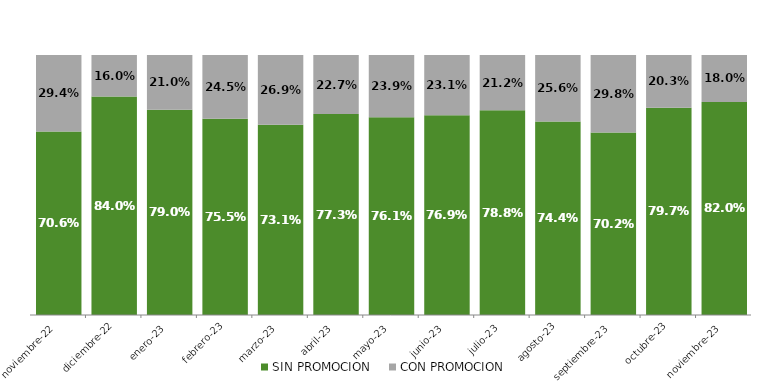
| Category | SIN PROMOCION   | CON PROMOCION   |
|---|---|---|
| 2022-11-01 | 0.706 | 0.294 |
| 2022-12-01 | 0.84 | 0.16 |
| 2023-01-01 | 0.79 | 0.21 |
| 2023-02-01 | 0.755 | 0.245 |
| 2023-03-01 | 0.731 | 0.269 |
| 2023-04-01 | 0.773 | 0.227 |
| 2023-05-01 | 0.761 | 0.239 |
| 2023-06-01 | 0.769 | 0.231 |
| 2023-07-01 | 0.788 | 0.212 |
| 2023-08-01 | 0.744 | 0.256 |
| 2023-09-01 | 0.702 | 0.298 |
| 2023-10-01 | 0.797 | 0.203 |
| 2023-11-01 | 0.82 | 0.18 |